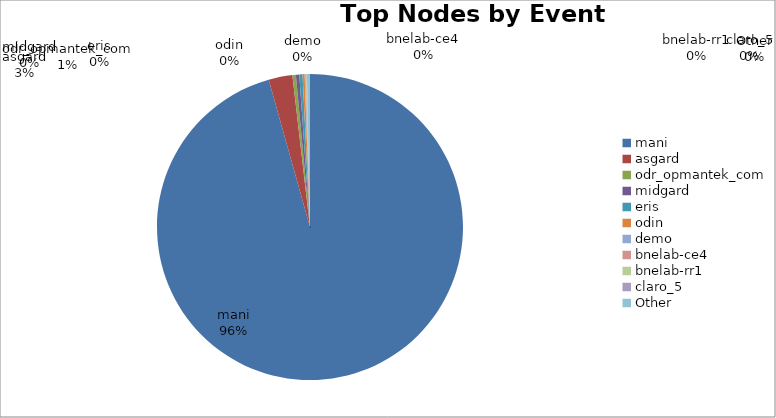
| Category | Series 0 |
|---|---|
| mani | 149688 |
| asgard | 3927 |
| odr_opmantek_com | 570 |
| midgard | 560 |
| eris | 528 |
| odin | 348 |
| demo | 135 |
| bnelab-ce4 | 88 |
| bnelab-rr1 | 79 |
| claro_5 | 67 |
| Other | 504 |